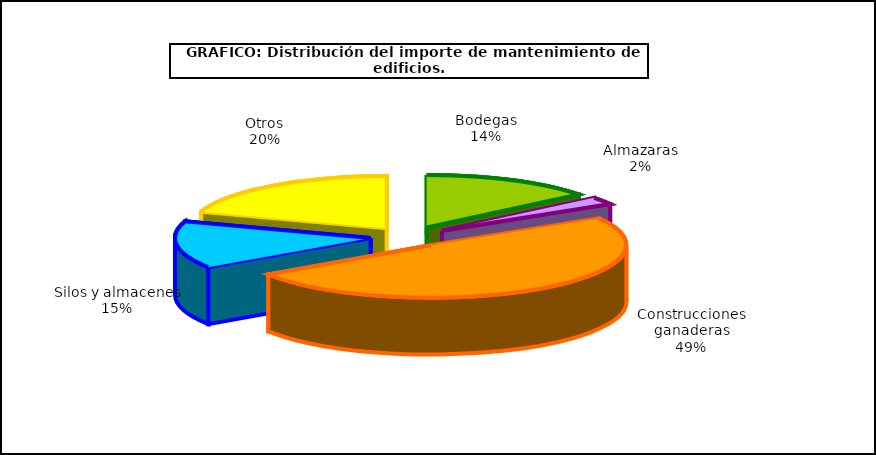
| Category | Series 0 |
|---|---|
| 0 | 73.482 |
| 1 | 11.878 |
| 2 | 254.83 |
| 3 | 75.519 |
| 4 | 102.968 |